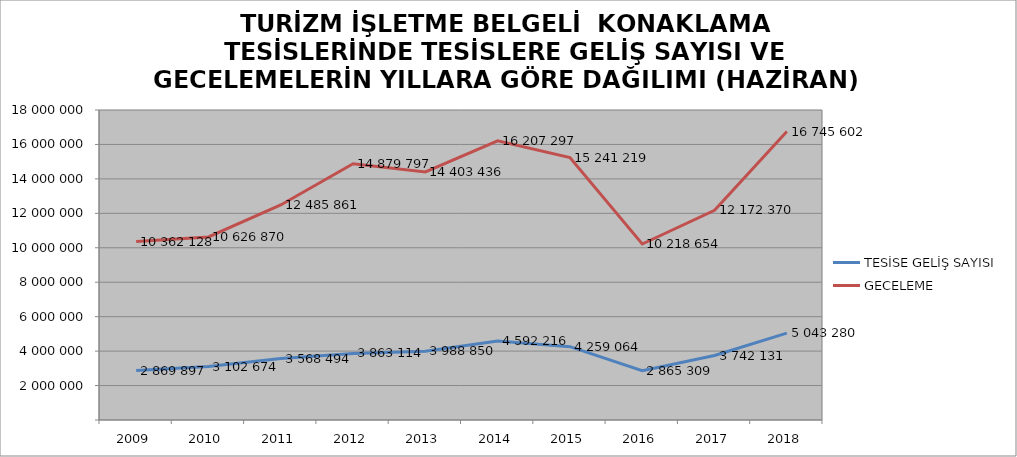
| Category | TESİSE GELİŞ SAYISI | GECELEME |
|---|---|---|
| 2009 | 2869897 | 10362128 |
| 2010 | 3102674 | 10626870 |
| 2011 | 3568494 | 12485861 |
| 2012 | 3863114 | 14879797 |
| 2013 | 3988850 | 14403436 |
| 2014 | 4592216 | 16207297 |
| 2015 | 4259064 | 15241219 |
| 2016 | 2865309 | 10218654 |
| 2017 | 3742131 | 12172370 |
| 2018 | 5043280 | 16745602 |